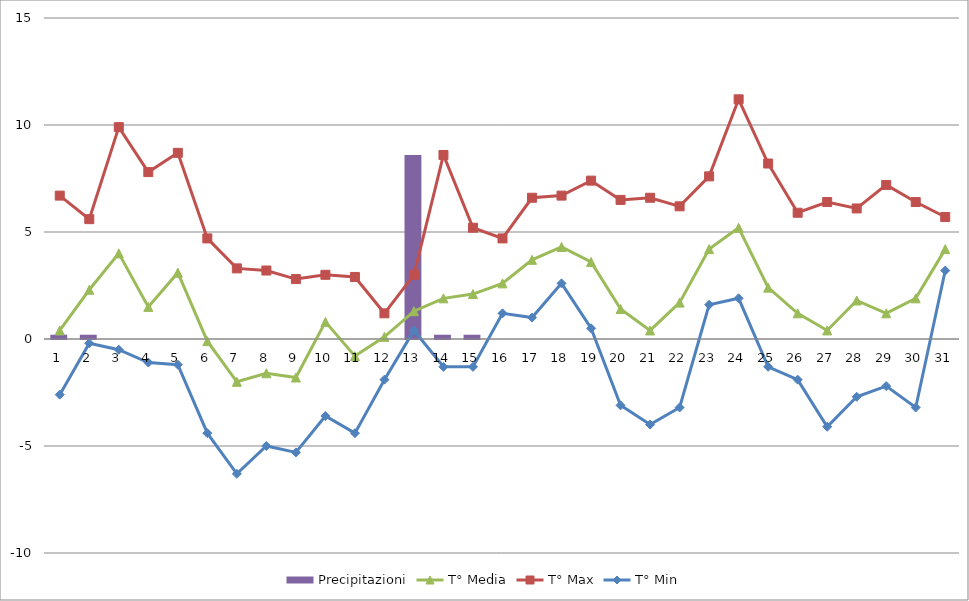
| Category | Precipitazioni |
|---|---|
| 0 | 0.2 |
| 1 | 0.2 |
| 2 | 0 |
| 3 | 0 |
| 4 | 0 |
| 5 | 0 |
| 6 | 0 |
| 7 | 0 |
| 8 | 0 |
| 9 | 0 |
| 10 | 0 |
| 11 | 0 |
| 12 | 8.6 |
| 13 | 0.2 |
| 14 | 0.2 |
| 15 | 0 |
| 16 | 0 |
| 17 | 0 |
| 18 | 0 |
| 19 | 0 |
| 20 | 0 |
| 21 | 0 |
| 22 | 0 |
| 23 | 0 |
| 24 | 0 |
| 25 | 0 |
| 26 | 0 |
| 27 | 0 |
| 28 | 0 |
| 29 | 0 |
| 30 | 0 |